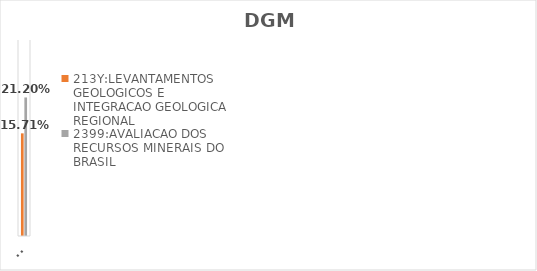
| Category | 213Y:LEVANTAMENTOS GEOLOGICOS E INTEGRACAO GEOLOGICA REGIONAL | 2399:AVALIACAO DOS RECURSOS MINERAIS DO BRASIL |
|---|---|---|
| EXECUTADO | 0.157 | 0.212 |